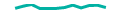
| Category | Series 0 |
|---|---|
| 0 | 45723 |
| 1 | 73024 |
| 2 | 94128 |
| 3 | 43232 |
| 4 | 44641 |
| 5 | 44798 |
| 6 | 55684 |
| 7 | 85847 |
| 8 | 51310 |
| 9 | 81482 |
| 10 | 83981 |
| 11 | 55594 |